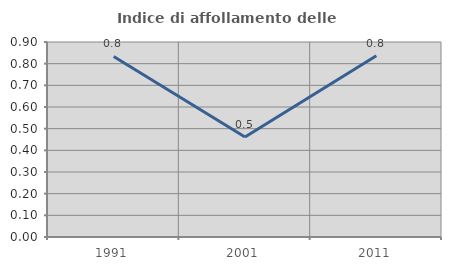
| Category | Indice di affollamento delle abitazioni  |
|---|---|
| 1991.0 | 0.833 |
| 2001.0 | 0.462 |
| 2011.0 | 0.837 |